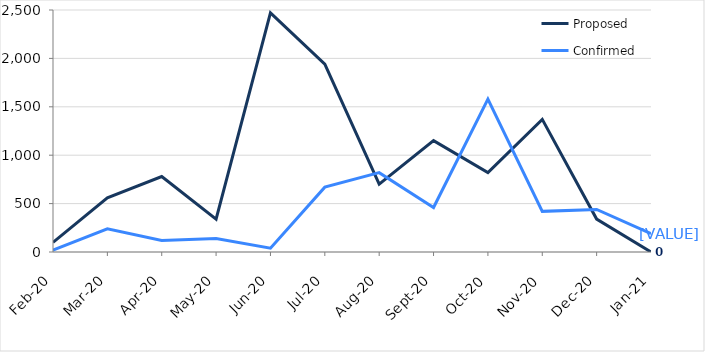
| Category | Proposed | Confirmed |
|---|---|---|
| 2020-02-01 | 100 | 20 |
| 2020-03-01 | 560 | 240 |
| 2020-04-01 | 780 | 120 |
| 2020-05-01 | 340 | 140 |
| 2020-06-01 | 2470 | 40 |
| 2020-07-01 | 1940 | 670 |
| 2020-08-01 | 700 | 820 |
| 2020-09-01 | 1150 | 460 |
| 2020-10-01 | 820 | 1580 |
| 2020-11-01 | 1370 | 420 |
| 2020-12-01 | 340 | 440 |
| 2021-01-01 | 0 | 190 |